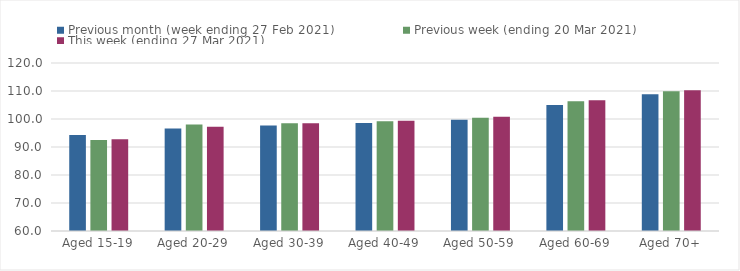
| Category | Previous month (week ending 27 Feb 2021) | Previous week (ending 20 Mar 2021) | This week (ending 27 Mar 2021) |
|---|---|---|---|
| Aged 15-19 | 94.29 | 92.52 | 92.73 |
| Aged 20-29 | 96.58 | 98.02 | 97.2 |
| Aged 30-39 | 97.65 | 98.47 | 98.5 |
| Aged 40-49 | 98.58 | 99.24 | 99.37 |
| Aged 50-59 | 99.74 | 100.49 | 100.79 |
| Aged 60-69 | 105.02 | 106.38 | 106.71 |
| Aged 70+ | 108.85 | 109.92 | 110.23 |